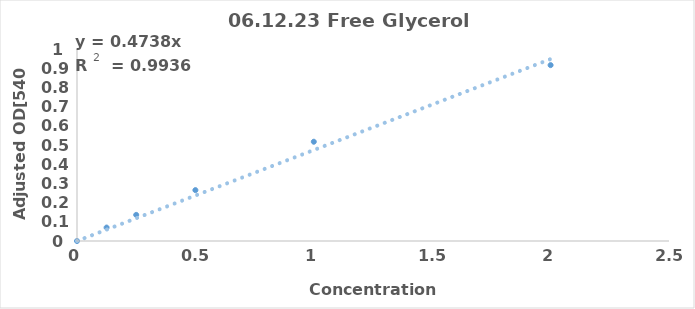
| Category | Series 0 |
|---|---|
| 0.0 | 0 |
| 0.125 | 0.07 |
| 0.25 | 0.136 |
| 0.5 | 0.265 |
| 1.0 | 0.517 |
| 2.0 | 0.916 |